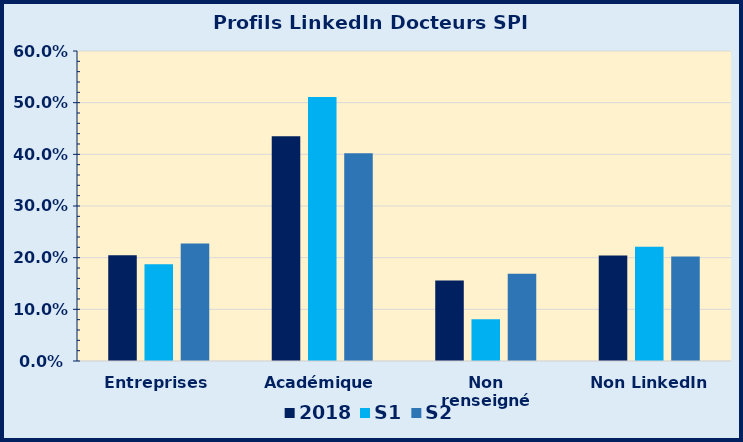
| Category | 2018 | S1 | S2 |
|---|---|---|---|
| Entreprises | 0.205 | 0.187 | 0.227 |
| Académique | 0.435 | 0.511 | 0.402 |
| Non renseigné | 0.156 | 0.081 | 0.169 |
| Non LinkedIn | 0.204 | 0.221 | 0.202 |